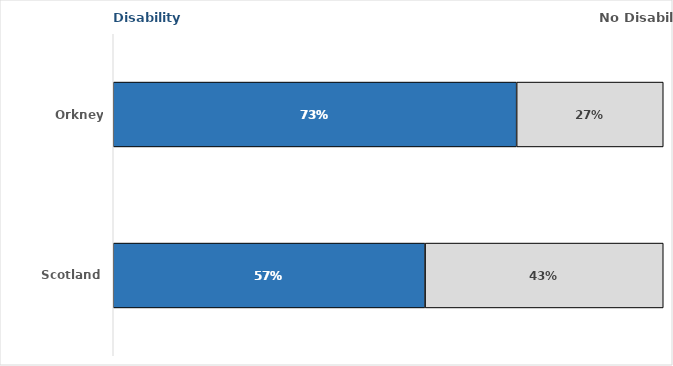
| Category | Disability | No Disability |
|---|---|---|
| Orkney Islands | 0.733 | 0.267 |
| Scotland | 0.567 | 0.433 |